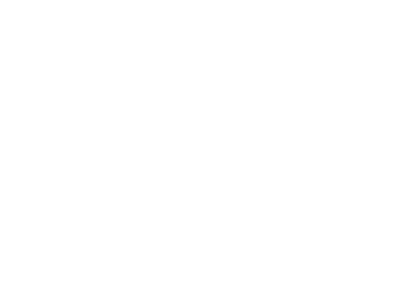
| Category | Total |
|---|---|
| A iniciar | 33 |
| Atrasado | 9 |
| Concluído | 5 |
| Em dia | 46 |
| Suspenso | 1 |
| - | 4 |